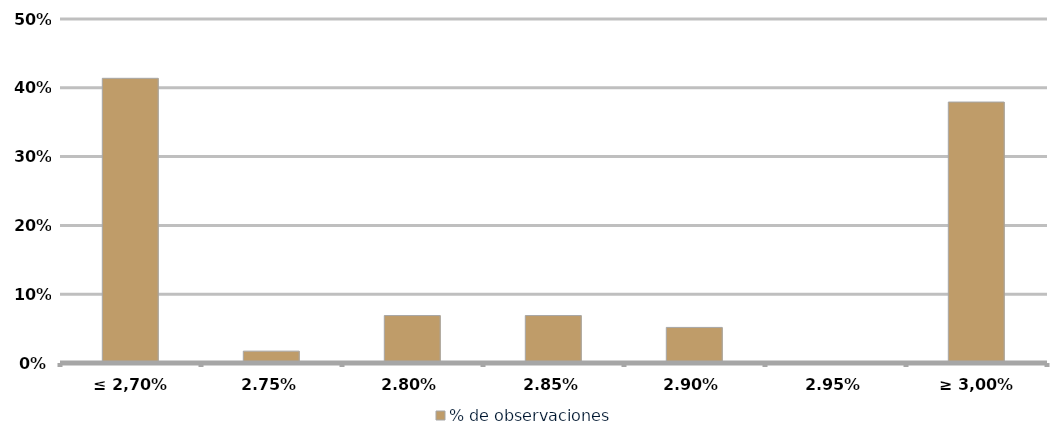
| Category | % de observaciones  |
|---|---|
| ≤ 2,70% | 0.414 |
| 2,75% | 0.017 |
| 2,80% | 0.069 |
| 2,85% | 0.069 |
| 2,90% | 0.052 |
| 2,95% | 0 |
| ≥ 3,00% | 0.379 |